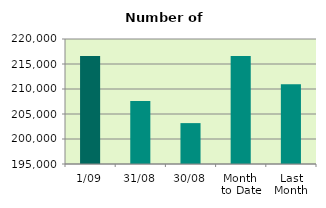
| Category | Series 0 |
|---|---|
| 1/09 | 216598 |
| 31/08 | 207580 |
| 30/08 | 203178 |
| Month 
to Date | 216598 |
| Last
Month | 210930.348 |